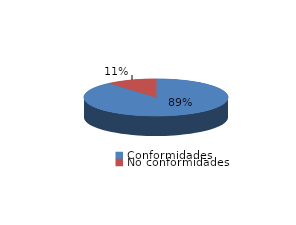
| Category | Series 0 |
|---|---|
| Conformidades | 166 |
| No conformidades | 21 |